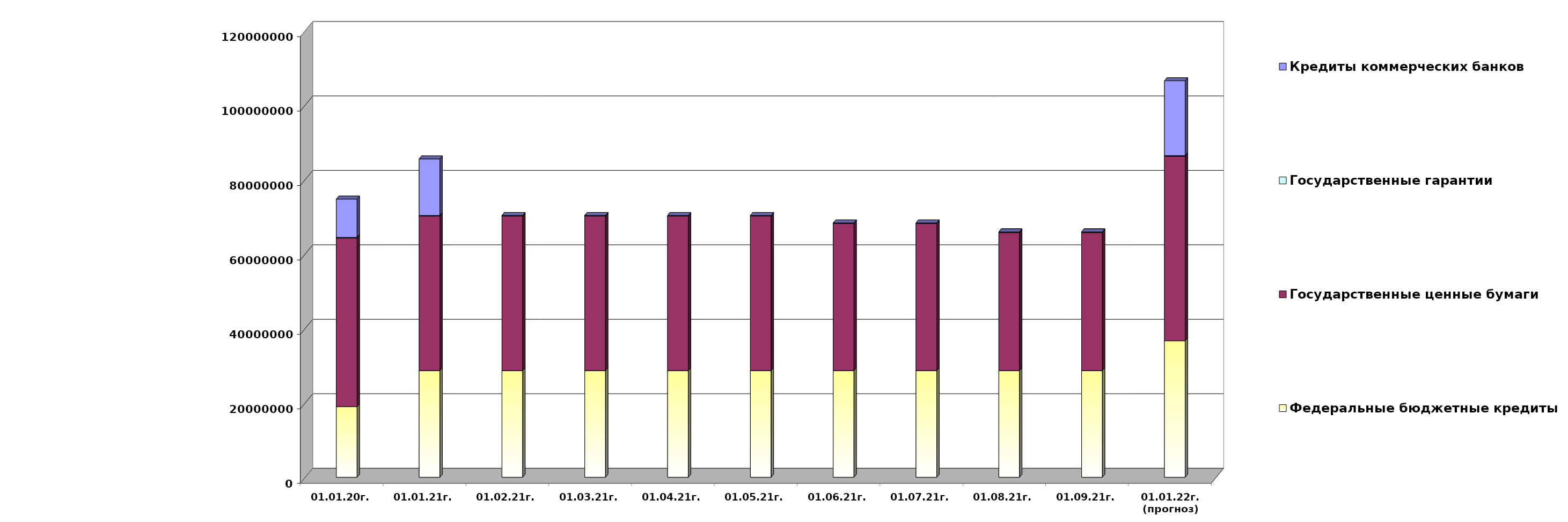
| Category | Федеральные бюджетные кредиты | Государственные ценные бумаги  | Государственные гарантии | Кредиты коммерческих банков |
|---|---|---|---|---|
| 01.01.20г. | 18954967.463 | 45300000 | 186330.02 | 10291177 |
| 01.01.21г. | 28654967.463 | 41500000 | 184738.25 | 15190000 |
| 01.02.21г. | 28654967.463 | 41500000 | 182966.25 | 0 |
| 01.03.21г. | 28654967.463 | 41500000 | 182966.25 | 0 |
| 01.04.21г. | 28654967.463 | 41500000 | 182966.25 | 0 |
| 01.05.21г. | 28654967.463 | 41500000 | 174735.46 | 0 |
| 01.06.21г. | 28654967.463 | 39500000 | 174735.46 | 0 |
| 01.07.21г. | 28654967.463 | 39500000 | 174735.46 | 0 |
| 01.08.21г. | 28654967.463 | 37100000 | 158212.22 | 0 |
| 01.09.21г. | 28654967.463 | 37100000 | 158212.22 | 0 |
| 01.01.22г.
(прогноз) | 36662617.9 | 49600000 | 141570.7 | 20110586.7 |